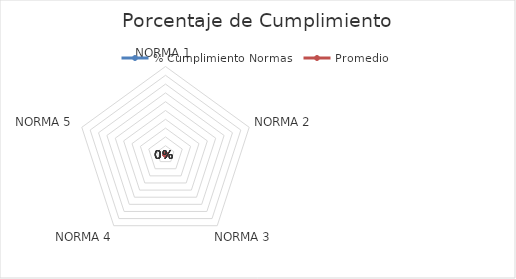
| Category | % Cumplimiento Normas | Promedio |
|---|---|---|
| NORMA 1 | 0 | 0 |
| NORMA 2 | 0 | 0 |
| NORMA 3 | 0 | 0 |
| NORMA 4 | 0 | 0 |
| NORMA 5 | 0 | 0 |